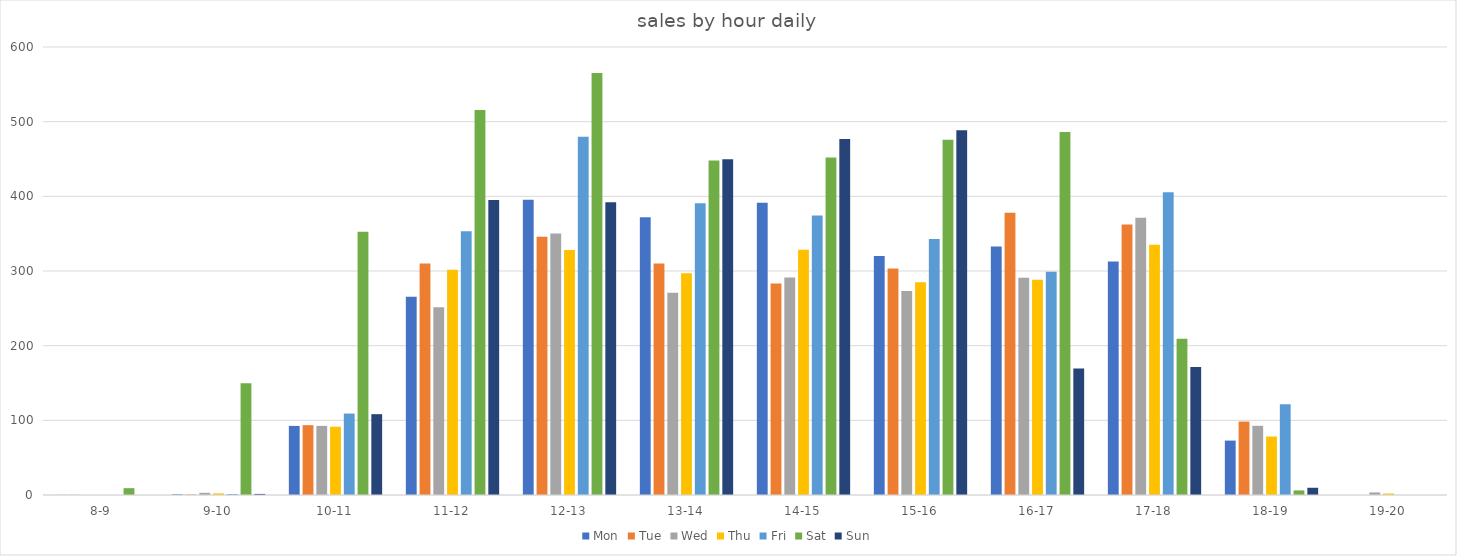
| Category | Mon | Tue | Wed | Thu | Fri | Sat | Sun |
|---|---|---|---|---|---|---|---|
| 8-9 | 0.169 | 0.276 | 0 | 0 | 0 | 9.143 | 0 |
| 9-10 | 0.972 | 0.683 | 2.876 | 2.15 | 1.367 | 149.791 | 1.45 |
| 10-11 | 92.537 | 93.509 | 92.559 | 91.45 | 109.066 | 352.52 | 108.258 |
| 11-12 | 265.37 | 309.886 | 251.578 | 301.661 | 353.328 | 515.734 | 395.063 |
| 12-13 | 395.465 | 345.885 | 350.388 | 328.135 | 479.789 | 565.169 | 391.968 |
| 13-14 | 372.077 | 309.878 | 270.84 | 296.908 | 390.735 | 447.834 | 449.778 |
| 14-15 | 391.477 | 283.222 | 291.188 | 328.456 | 374.401 | 451.911 | 476.669 |
| 15-16 | 319.944 | 303.495 | 273.278 | 284.933 | 342.75 | 475.713 | 488.618 |
| 16-17 | 332.965 | 378.102 | 291.124 | 288.118 | 299.093 | 486.041 | 169.463 |
| 17-18 | 312.609 | 362.444 | 371.188 | 335.229 | 405.636 | 209.342 | 171.519 |
| 18-19 | 72.864 | 98.341 | 92.639 | 78.35 | 121.694 | 6.15 | 9.687 |
| 19-20 | 0 | 0 | 3.444 | 2.023 | 0 | 0 | 0 |